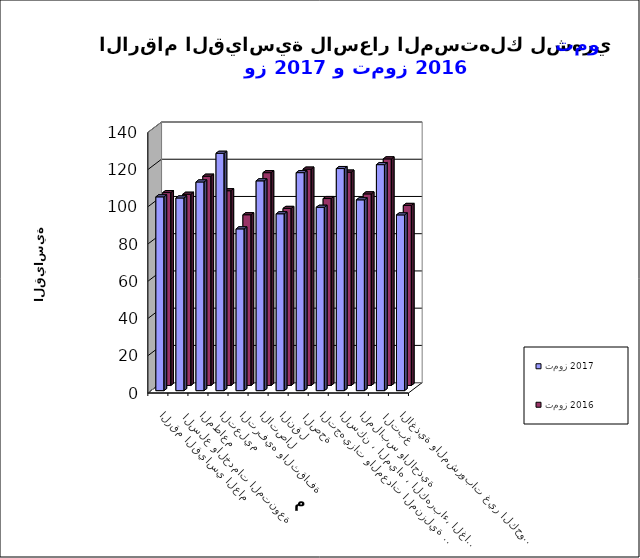
| Category | تموز 2017      | تموز 2016 |
|---|---|---|
| الاغذية والمشروبات غير الكحولية | 94.4 | 96.7 |
|  التبغ | 121.4 | 121.7 |
| الملابس والاحذية | 102.5 | 102.9 |
| السكن ، المياه ، الكهرباء، الغاز  | 119.3 | 114.6 |
| التجهيزات والمعدات المنزلية والصيانة | 98.5 | 100.4 |
|  الصحة | 117.1 | 116.2 |
| النقل | 95 | 95.1 |
| الاتصال | 112.7 | 114.3 |
| الترفيه والثقافة | 86.9 | 91.7 |
| التعليم | 127.5 | 104.6 |
| المطاعم  | 112.1 | 112.4 |
|  السلع والخدمات المتنوعة | 103.5 | 102.7 |
| الرقم القياسي العام | 104.1 | 103.6 |